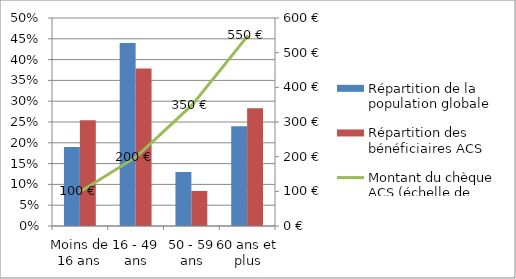
| Category | Répartition de la population globale | Répartition des bénéficiaires ACS |
|---|---|---|
| Moins de 16 ans | 0.19 | 0.254 |
| 16 - 49 ans | 0.44 | 0.378 |
| 50 - 59 ans | 0.13 | 0.084 |
| 60 ans et plus | 0.24 | 0.283 |